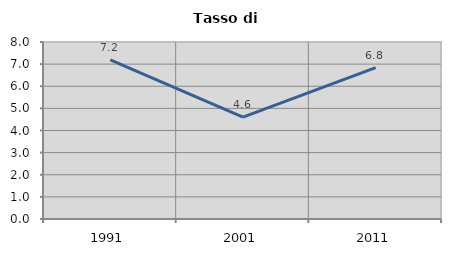
| Category | Tasso di disoccupazione   |
|---|---|
| 1991.0 | 7.187 |
| 2001.0 | 4.606 |
| 2011.0 | 6.845 |